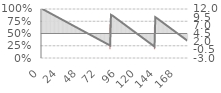
| Category | Engine |
|---|---|
| 0 | 0 |
| 1 | 0 |
| 2 | 0 |
| 3 | 0 |
| 4 | 0 |
| 5 | 0 |
| 6 | 0 |
| 7 | 0 |
| 8 | 0 |
| 9 | 0 |
| 10 | 0 |
| 11 | 0 |
| 12 | 0 |
| 13 | 0 |
| 14 | 0 |
| 15 | 0 |
| 16 | 0 |
| 17 | 0 |
| 18 | 0 |
| 19 | 0 |
| 20 | 0 |
| 21 | 0 |
| 22 | 0 |
| 23 | 0 |
| 24 | 0 |
| 25 | 0 |
| 26 | 0 |
| 27 | 0 |
| 28 | 0 |
| 29 | 0 |
| 30 | 0 |
| 31 | 0 |
| 32 | 0 |
| 33 | 0 |
| 34 | 0 |
| 35 | 0 |
| 36 | 0 |
| 37 | 0 |
| 38 | 0 |
| 39 | 0 |
| 40 | 0 |
| 41 | 0 |
| 42 | 0 |
| 43 | 0 |
| 44 | 0 |
| 45 | 0 |
| 46 | 0 |
| 47 | 0 |
| 48 | 0 |
| 49 | 0 |
| 50 | 0 |
| 51 | 0 |
| 52 | 0 |
| 53 | 0 |
| 54 | 0 |
| 55 | 0 |
| 56 | 0 |
| 57 | 0 |
| 58 | 0 |
| 59 | 0 |
| 60 | 0 |
| 61 | 0 |
| 62 | 0 |
| 63 | 0 |
| 64 | 0 |
| 65 | 0 |
| 66 | 0 |
| 67 | 0 |
| 68 | 0 |
| 69 | 0 |
| 70 | 0 |
| 71 | 0 |
| 72 | 0 |
| 73 | 0 |
| 74 | 0 |
| 75 | 0 |
| 76 | 0 |
| 77 | 0 |
| 78 | 0 |
| 79 | 0 |
| 80 | 0 |
| 81 | 0 |
| 82 | 0 |
| 83 | 0 |
| 84 | 0 |
| 85 | 7307280 |
| 86 | 0 |
| 87 | 0 |
| 88 | 0 |
| 89 | 0 |
| 90 | 0 |
| 91 | 0 |
| 92 | 0 |
| 93 | 0 |
| 94 | 0 |
| 95 | 0 |
| 96 | 0 |
| 97 | 0 |
| 98 | 0 |
| 99 | 0 |
| 100 | 0 |
| 101 | 0 |
| 102 | 0 |
| 103 | 0 |
| 104 | 0 |
| 105 | 0 |
| 106 | 0 |
| 107 | 0 |
| 108 | 0 |
| 109 | 0 |
| 110 | 0 |
| 111 | 0 |
| 112 | 0 |
| 113 | 0 |
| 114 | 0 |
| 115 | 0 |
| 116 | 0 |
| 117 | 0 |
| 118 | 0 |
| 119 | 0 |
| 120 | 0 |
| 121 | 0 |
| 122 | 0 |
| 123 | 0 |
| 124 | 0 |
| 125 | 0 |
| 126 | 0 |
| 127 | 0 |
| 128 | 0 |
| 129 | 0 |
| 130 | 0 |
| 131 | 0 |
| 132 | 0 |
| 133 | 0 |
| 134 | 0 |
| 135 | 0 |
| 136 | 0 |
| 137 | 0 |
| 138 | 0 |
| 139 | 0 |
| 140 | 6481755 |
| 141 | 0 |
| 142 | 0 |
| 143 | 0 |
| 144 | 0 |
| 145 | 0 |
| 146 | 0 |
| 147 | 0 |
| 148 | 0 |
| 149 | 0 |
| 150 | 0 |
| 151 | 0 |
| 152 | 0 |
| 153 | 0 |
| 154 | 0 |
| 155 | 0 |
| 156 | 0 |
| 157 | 0 |
| 158 | 0 |
| 159 | 0 |
| 160 | 0 |
| 161 | 0 |
| 162 | 0 |
| 163 | 0 |
| 164 | 0 |
| 165 | 0 |
| 166 | 0 |
| 167 | 0 |
| 168 | 0 |
| 169 | 0 |
| 170 | 0 |
| 171 | 0 |
| 172 | 0 |
| 173 | 0 |
| 174 | 0 |
| 175 | 0 |
| 176 | 0 |
| 177 | 0 |
| 178 | 0 |
| 179 | 0 |
| 180 | 0 |